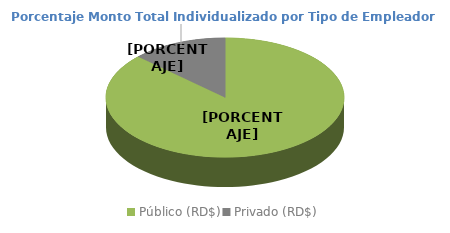
| Category | Series 0 |
|---|---|
| Público (RD$) | 0.87 |
| Privado (RD$) | 0.13 |